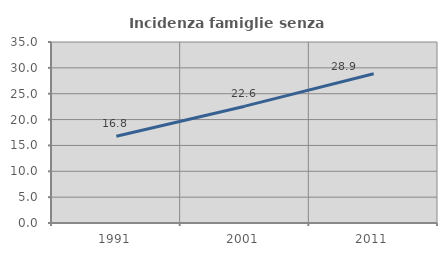
| Category | Incidenza famiglie senza nuclei |
|---|---|
| 1991.0 | 16.765 |
| 2001.0 | 22.592 |
| 2011.0 | 28.859 |